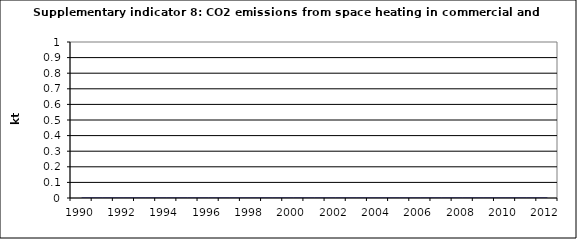
| Category | CO2 emissions from space heating in commercial and institutional, kt |
|---|---|
| 1990 | 0 |
| 1991 | 0 |
| 1992 | 0 |
| 1993 | 0 |
| 1994 | 0 |
| 1995 | 0 |
| 1996 | 0 |
| 1997 | 0 |
| 1998 | 0 |
| 1999 | 0 |
| 2000 | 0 |
| 2001 | 0 |
| 2002 | 0 |
| 2003 | 0 |
| 2004 | 0 |
| 2005 | 0 |
| 2006 | 0 |
| 2007 | 0 |
| 2008 | 0 |
| 2009 | 0 |
| 2010 | 0 |
| 2011 | 0 |
| 2012 | 0 |